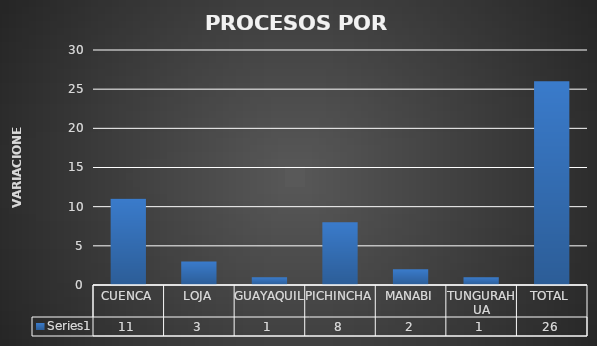
| Category | Series 0 |
|---|---|
| CUENCA | 11 |
| LOJA | 3 |
| GUAYAQUIL | 1 |
| PICHINCHA | 8 |
| MANABI | 2 |
| TUNGURAHUA | 1 |
| TOTAL | 26 |